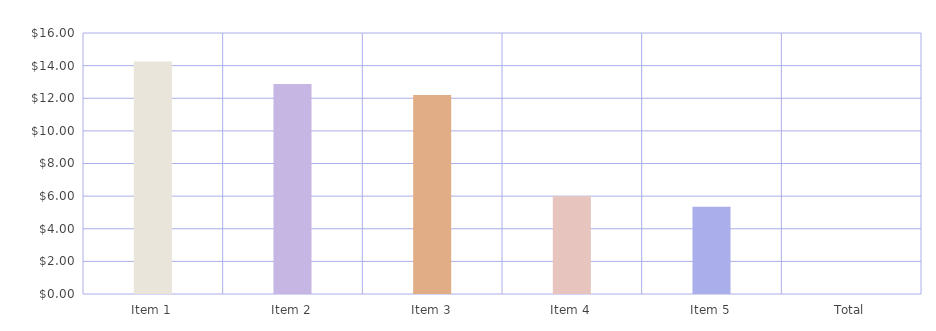
| Category | Profit per item 
(incl. shipping) |
|---|---|
| Item 1 | 14.25 |
| Item 2 | 12.875 |
| Item 3 | 12.2 |
| Item 4 | 6 |
| Item 5 | 5.35 |